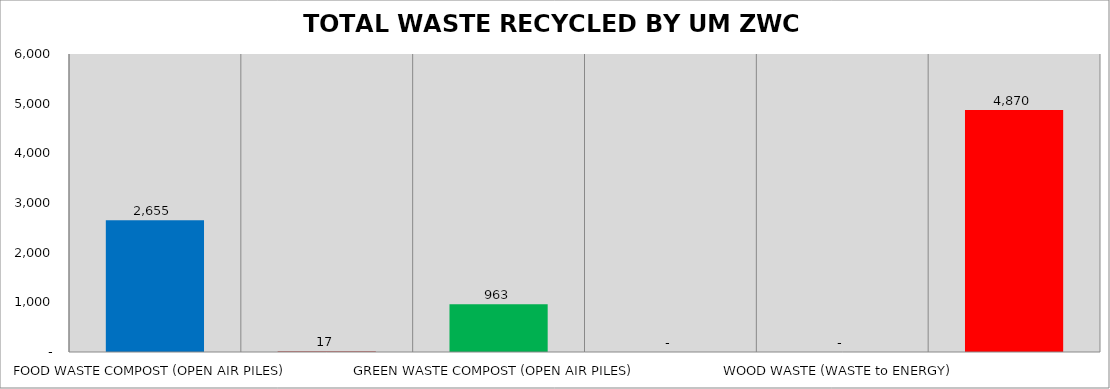
| Category | Series 1 |
|---|---|
| FOOD WASTE COMPOST (OPEN AIR PILES) | 2655 |
| FOOD WASTE DIGESTED (ANAEROBIC DIGESTION) | 17 |
| GREEN WASTE COMPOST (OPEN AIR PILES) | 963 |
| TEXTILE WASTE RECYCLED/REUSED | 0 |
| WOOD WASTE (WASTE to ENERGY) | 0 |
| WASTE/MATERIAL SEPARATED & COLLECTED | 4870 |